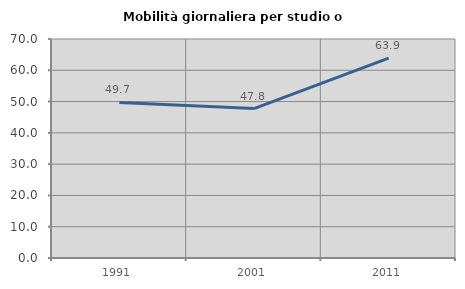
| Category | Mobilità giornaliera per studio o lavoro |
|---|---|
| 1991.0 | 49.722 |
| 2001.0 | 47.764 |
| 2011.0 | 63.916 |